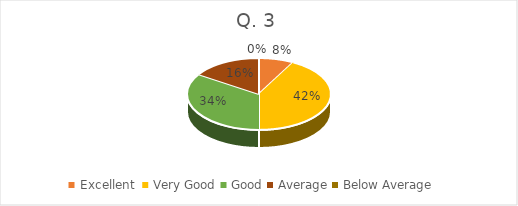
| Category | Series 0 |
|---|---|
| Excellent  | 3 |
| Very Good | 16 |
| Good | 13 |
| Average | 6 |
| Below Average | 0 |